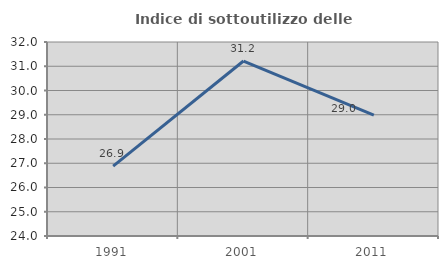
| Category | Indice di sottoutilizzo delle abitazioni  |
|---|---|
| 1991.0 | 26.882 |
| 2001.0 | 31.215 |
| 2011.0 | 28.987 |